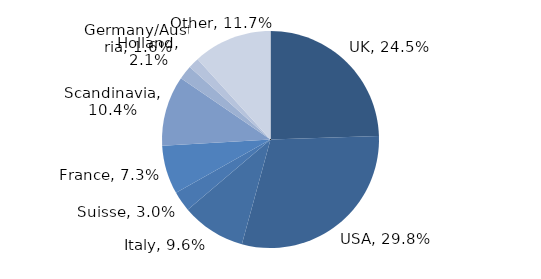
| Category | Investment Style |
|---|---|
| UK | 0.245 |
| USA | 0.298 |
| Italy | 0.096 |
| Suisse | 0.03 |
| France | 0.073 |
| Scandinavia | 0.104 |
| Holland | 0.021 |
| Germany/Austria | 0.016 |
| Other | 0.117 |